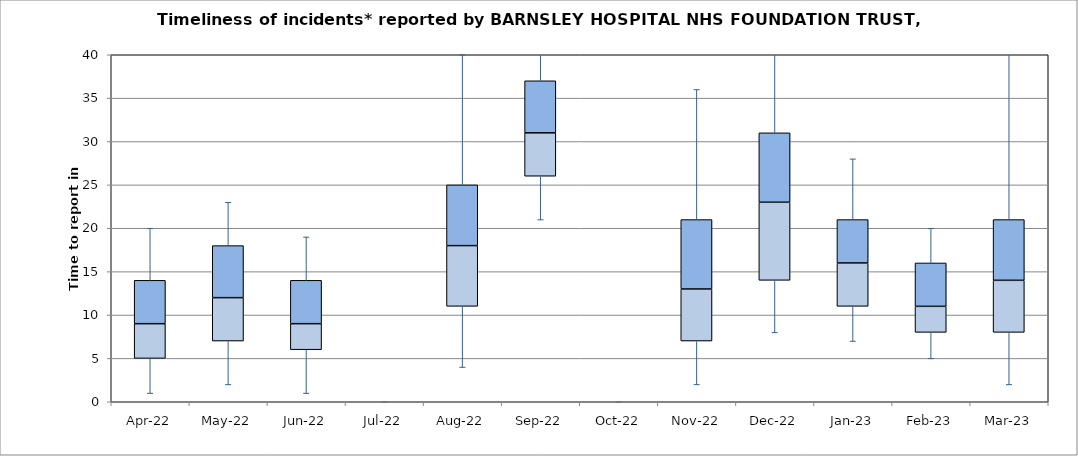
| Category | Series 0 | Series 1 | Series 2 |
|---|---|---|---|
| Apr-22 | 5 | 4 | 5 |
| May-22 | 7 | 5 | 6 |
| Jun-22 | 6 | 3 | 5 |
| Jul-22 | 0 | 0 | 0 |
| Aug-22 | 11 | 7 | 7 |
| Sep-22 | 26 | 5 | 6 |
| Oct-22 | 0 | 0 | 0 |
| Nov-22 | 7 | 6 | 8 |
| Dec-22 | 14 | 9 | 8 |
| Jan-23 | 11 | 5 | 5 |
| Feb-23 | 8 | 3 | 5 |
| Mar-23 | 8 | 6 | 7 |